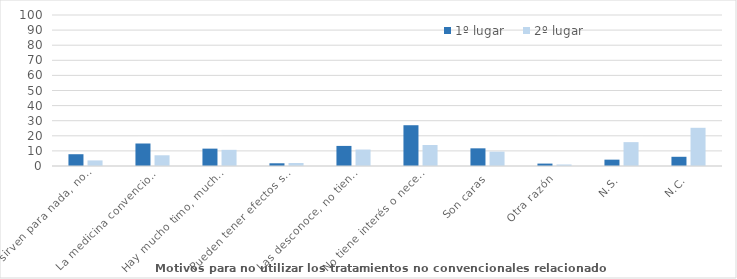
| Category | 1º lugar | 2º lugar |
|---|---|---|
| No sirven para nada, no son efectivas | 7.8 | 3.7 |
| La medicina convencional es suficiente | 14.9 | 7.1 |
| Hay mucho timo, mucho engaño | 11.5 | 10.7 |
| Pueden tener efectos secundarios | 1.8 | 2 |
| Las desconoce, no tiene información | 13.3 | 10.9 |
| No tiene interés o necesidad | 27 | 13.9 |
| Son caras | 11.7 | 9.5 |
| Otra razón | 1.6 | 1 |
| N.S. | 4.2 | 15.8 |
| N.C. | 6.1 | 25.3 |